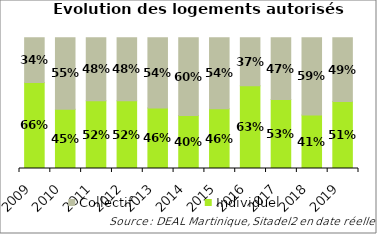
| Category | Individuel | Collectif |
|---|---|---|
| 2009.0 | 0.658 | 0.342 |
| 2010.0 | 0.452 | 0.548 |
| 2011.0 | 0.518 | 0.482 |
| 2012.0 | 0.519 | 0.481 |
| 2013.0 | 0.463 | 0.537 |
| 2014.0 | 0.404 | 0.596 |
| 2015.0 | 0.457 | 0.543 |
| 2016.0 | 0.633 | 0.367 |
| 2017.0 | 0.528 | 0.472 |
| 2018.0 | 0.41 | 0.59 |
| 2019.0 | 0.512 | 0.488 |